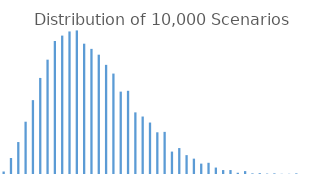
| Category | Series 0 |
|---|---|
| 0 | 12 |
| 1 | 77 |
| 2 | 154 |
| 3 | 252 |
| 4 | 356 |
| 5 | 463 |
| 6 | 551 |
| 7 | 641 |
| 8 | 667 |
| 9 | 687 |
| 10 | 692 |
| 11 | 628 |
| 12 | 603 |
| 13 | 575 |
| 14 | 526 |
| 15 | 484 |
| 16 | 397 |
| 17 | 401 |
| 18 | 297 |
| 19 | 277 |
| 20 | 248 |
| 21 | 201 |
| 22 | 203 |
| 23 | 108 |
| 24 | 125 |
| 25 | 91 |
| 26 | 74 |
| 27 | 50 |
| 28 | 54 |
| 29 | 31 |
| 30 | 19 |
| 31 | 19 |
| 32 | 6 |
| 33 | 14 |
| 34 | 3 |
| 35 | 4 |
| 36 | 2 |
| 37 | 3 |
| 38 | 1 |
| 39 | 1 |
| 40 | 3 |